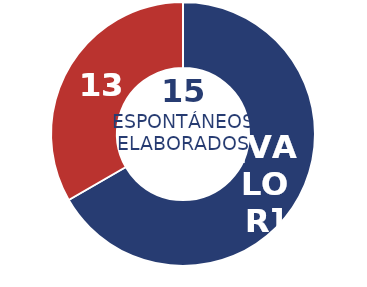
| Category | Series 0 |
|---|---|
| Física | 26 |
| Jurídica | 13 |